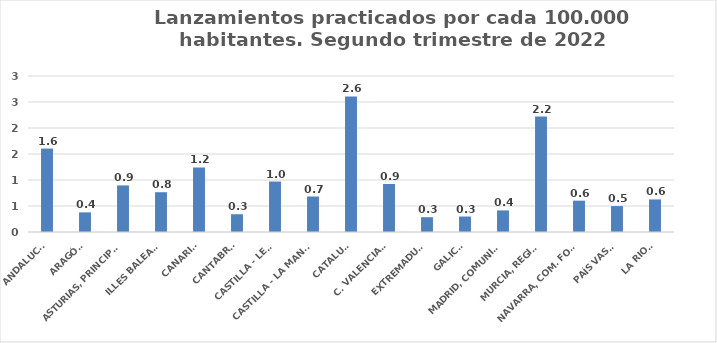
| Category | Series 0 |
|---|---|
| ANDALUCÍA | 1.605 |
| ARAGÓN | 0.377 |
| ASTURIAS, PRINCIPADO | 0.896 |
| ILLES BALEARS | 0.765 |
| CANARIAS | 1.241 |
| CANTABRIA | 0.342 |
| CASTILLA - LEÓN | 0.97 |
| CASTILLA - LA MANCHA | 0.682 |
| CATALUÑA | 2.608 |
| C. VALENCIANA | 0.923 |
| EXTREMADURA | 0.285 |
| GALICIA | 0.297 |
| MADRID, COMUNIDAD | 0.415 |
| MURCIA, REGIÓN | 2.22 |
| NAVARRA, COM. FORAL | 0.603 |
| PAÍS VASCO | 0.498 |
| LA RIOJA | 0.626 |